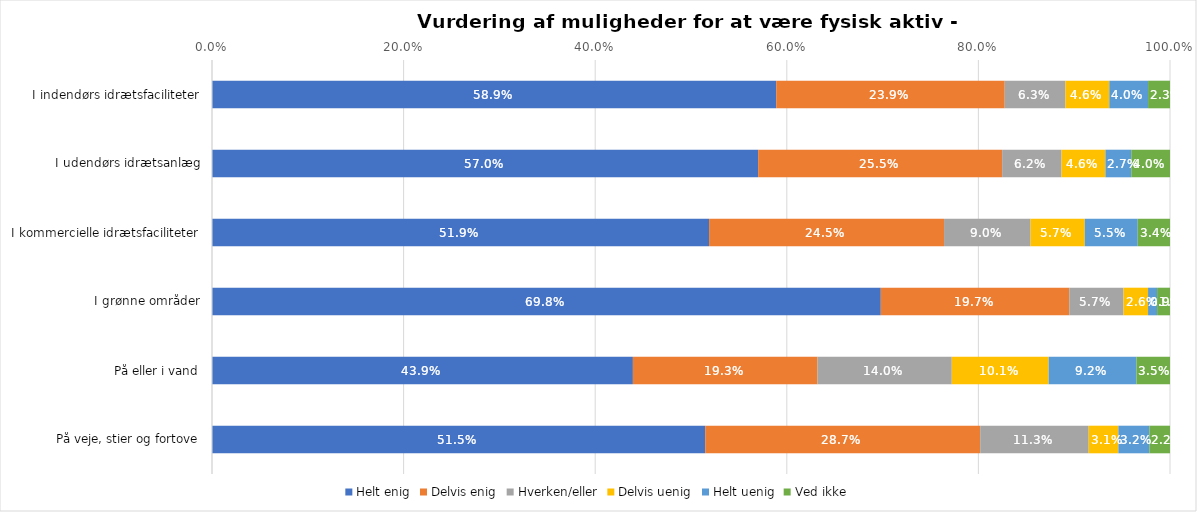
| Category | Helt enig | Delvis enig | Hverken/eller | Delvis uenig | Helt uenig | Ved ikke |
|---|---|---|---|---|---|---|
| I indendørs idrætsfaciliteter | 0.589 | 0.239 | 0.063 | 0.046 | 0.04 | 0.023 |
| I udendørs idrætsanlæg | 0.57 | 0.255 | 0.062 | 0.046 | 0.027 | 0.04 |
| I kommercielle idrætsfaciliteter | 0.519 | 0.245 | 0.09 | 0.057 | 0.055 | 0.034 |
| I grønne områder | 0.698 | 0.197 | 0.057 | 0.026 | 0.009 | 0.013 |
| På eller i vand | 0.439 | 0.193 | 0.14 | 0.101 | 0.092 | 0.035 |
| På veje, stier og fortove | 0.515 | 0.287 | 0.113 | 0.031 | 0.032 | 0.022 |